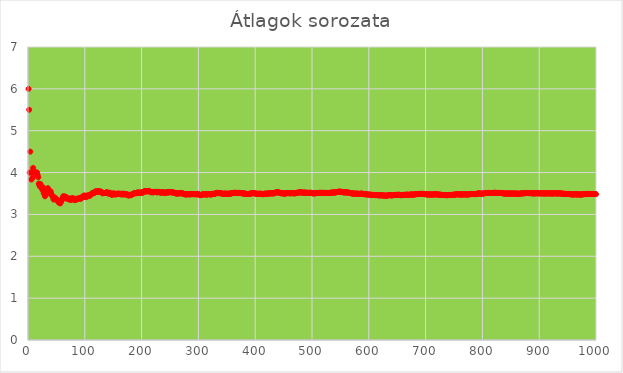
| Category | Series 0 |
|---|---|
| 1.0 | 6 |
| 2.0 | 5.5 |
| 3.0 | 4 |
| 4.0 | 4.5 |
| 5.0 | 4 |
| 6.0 | 3.833 |
| 7.0 | 4 |
| 8.0 | 3.875 |
| 9.0 | 4.111 |
| 10.0 | 4 |
| 11.0 | 4 |
| 12.0 | 4 |
| 13.0 | 4 |
| 14.0 | 4 |
| 15.0 | 4 |
| 16.0 | 4 |
| 17.0 | 3.941 |
| 18.0 | 3.889 |
| 19.0 | 3.737 |
| 20.0 | 3.7 |
| 21.0 | 3.667 |
| 22.0 | 3.727 |
| 23.0 | 3.652 |
| 24.0 | 3.667 |
| 25.0 | 3.6 |
| 26.0 | 3.654 |
| 27.0 | 3.556 |
| 28.0 | 3.5 |
| 29.0 | 3.483 |
| 30.0 | 3.433 |
| 31.0 | 3.484 |
| 32.0 | 3.531 |
| 33.0 | 3.515 |
| 34.0 | 3.559 |
| 35.0 | 3.629 |
| 36.0 | 3.583 |
| 37.0 | 3.514 |
| 38.0 | 3.5 |
| 39.0 | 3.538 |
| 40.0 | 3.55 |
| 41.0 | 3.488 |
| 42.0 | 3.452 |
| 43.0 | 3.442 |
| 44.0 | 3.409 |
| 45.0 | 3.356 |
| 46.0 | 3.413 |
| 47.0 | 3.383 |
| 48.0 | 3.375 |
| 49.0 | 3.388 |
| 50.0 | 3.36 |
| 51.0 | 3.353 |
| 52.0 | 3.327 |
| 53.0 | 3.302 |
| 54.0 | 3.315 |
| 55.0 | 3.273 |
| 56.0 | 3.286 |
| 57.0 | 3.263 |
| 58.0 | 3.31 |
| 59.0 | 3.322 |
| 60.0 | 3.35 |
| 61.0 | 3.393 |
| 62.0 | 3.435 |
| 63.0 | 3.397 |
| 64.0 | 3.406 |
| 65.0 | 3.431 |
| 66.0 | 3.409 |
| 67.0 | 3.418 |
| 68.0 | 3.382 |
| 69.0 | 3.391 |
| 70.0 | 3.371 |
| 71.0 | 3.366 |
| 72.0 | 3.375 |
| 73.0 | 3.356 |
| 74.0 | 3.378 |
| 75.0 | 3.347 |
| 76.0 | 3.382 |
| 77.0 | 3.351 |
| 78.0 | 3.372 |
| 79.0 | 3.392 |
| 80.0 | 3.362 |
| 81.0 | 3.358 |
| 82.0 | 3.341 |
| 83.0 | 3.361 |
| 84.0 | 3.345 |
| 85.0 | 3.376 |
| 86.0 | 3.36 |
| 87.0 | 3.368 |
| 88.0 | 3.375 |
| 89.0 | 3.382 |
| 90.0 | 3.389 |
| 91.0 | 3.385 |
| 92.0 | 3.38 |
| 93.0 | 3.376 |
| 94.0 | 3.383 |
| 95.0 | 3.411 |
| 96.0 | 3.427 |
| 97.0 | 3.412 |
| 98.0 | 3.439 |
| 99.0 | 3.455 |
| 100.0 | 3.43 |
| 101.0 | 3.426 |
| 102.0 | 3.412 |
| 103.0 | 3.437 |
| 104.0 | 3.452 |
| 105.0 | 3.429 |
| 106.0 | 3.453 |
| 107.0 | 3.458 |
| 108.0 | 3.444 |
| 109.0 | 3.468 |
| 110.0 | 3.455 |
| 111.0 | 3.477 |
| 112.0 | 3.5 |
| 113.0 | 3.504 |
| 114.0 | 3.518 |
| 115.0 | 3.504 |
| 116.0 | 3.517 |
| 117.0 | 3.513 |
| 118.0 | 3.534 |
| 119.0 | 3.555 |
| 120.0 | 3.533 |
| 121.0 | 3.545 |
| 122.0 | 3.549 |
| 123.0 | 3.545 |
| 124.0 | 3.548 |
| 125.0 | 3.56 |
| 126.0 | 3.54 |
| 127.0 | 3.535 |
| 128.0 | 3.547 |
| 129.0 | 3.543 |
| 130.0 | 3.523 |
| 131.0 | 3.504 |
| 132.0 | 3.508 |
| 133.0 | 3.511 |
| 134.0 | 3.515 |
| 135.0 | 3.511 |
| 136.0 | 3.515 |
| 137.0 | 3.511 |
| 138.0 | 3.529 |
| 139.0 | 3.532 |
| 140.0 | 3.514 |
| 141.0 | 3.511 |
| 142.0 | 3.493 |
| 143.0 | 3.503 |
| 144.0 | 3.521 |
| 145.0 | 3.503 |
| 146.0 | 3.486 |
| 147.0 | 3.476 |
| 148.0 | 3.466 |
| 149.0 | 3.483 |
| 150.0 | 3.5 |
| 151.0 | 3.503 |
| 152.0 | 3.493 |
| 153.0 | 3.477 |
| 154.0 | 3.474 |
| 155.0 | 3.49 |
| 156.0 | 3.494 |
| 157.0 | 3.497 |
| 158.0 | 3.487 |
| 159.0 | 3.497 |
| 160.0 | 3.494 |
| 161.0 | 3.491 |
| 162.0 | 3.494 |
| 163.0 | 3.479 |
| 164.0 | 3.488 |
| 165.0 | 3.497 |
| 166.0 | 3.482 |
| 167.0 | 3.473 |
| 168.0 | 3.488 |
| 169.0 | 3.497 |
| 170.0 | 3.482 |
| 171.0 | 3.48 |
| 172.0 | 3.483 |
| 173.0 | 3.474 |
| 174.0 | 3.477 |
| 175.0 | 3.48 |
| 176.0 | 3.466 |
| 177.0 | 3.452 |
| 178.0 | 3.455 |
| 179.0 | 3.464 |
| 180.0 | 3.472 |
| 181.0 | 3.459 |
| 182.0 | 3.467 |
| 183.0 | 3.475 |
| 184.0 | 3.484 |
| 185.0 | 3.497 |
| 186.0 | 3.495 |
| 187.0 | 3.503 |
| 188.0 | 3.511 |
| 189.0 | 3.503 |
| 190.0 | 3.511 |
| 191.0 | 3.508 |
| 192.0 | 3.516 |
| 193.0 | 3.528 |
| 194.0 | 3.521 |
| 195.0 | 3.518 |
| 196.0 | 3.51 |
| 197.0 | 3.518 |
| 198.0 | 3.525 |
| 199.0 | 3.518 |
| 200.0 | 3.53 |
| 201.0 | 3.517 |
| 202.0 | 3.525 |
| 203.0 | 3.532 |
| 204.0 | 3.544 |
| 205.0 | 3.556 |
| 206.0 | 3.558 |
| 207.0 | 3.556 |
| 208.0 | 3.553 |
| 209.0 | 3.545 |
| 210.0 | 3.557 |
| 211.0 | 3.559 |
| 212.0 | 3.561 |
| 213.0 | 3.549 |
| 214.0 | 3.551 |
| 215.0 | 3.549 |
| 216.0 | 3.537 |
| 217.0 | 3.53 |
| 218.0 | 3.532 |
| 219.0 | 3.525 |
| 220.0 | 3.536 |
| 221.0 | 3.529 |
| 222.0 | 3.536 |
| 223.0 | 3.534 |
| 224.0 | 3.54 |
| 225.0 | 3.538 |
| 226.0 | 3.535 |
| 227.0 | 3.524 |
| 228.0 | 3.531 |
| 229.0 | 3.541 |
| 230.0 | 3.535 |
| 231.0 | 3.537 |
| 232.0 | 3.526 |
| 233.0 | 3.519 |
| 234.0 | 3.521 |
| 235.0 | 3.523 |
| 236.0 | 3.525 |
| 237.0 | 3.527 |
| 238.0 | 3.534 |
| 239.0 | 3.523 |
| 240.0 | 3.512 |
| 241.0 | 3.515 |
| 242.0 | 3.512 |
| 243.0 | 3.523 |
| 244.0 | 3.533 |
| 245.0 | 3.527 |
| 246.0 | 3.524 |
| 247.0 | 3.522 |
| 248.0 | 3.532 |
| 249.0 | 3.538 |
| 250.0 | 3.536 |
| 251.0 | 3.526 |
| 252.0 | 3.536 |
| 253.0 | 3.53 |
| 254.0 | 3.531 |
| 255.0 | 3.529 |
| 256.0 | 3.52 |
| 257.0 | 3.514 |
| 258.0 | 3.519 |
| 259.0 | 3.51 |
| 260.0 | 3.504 |
| 261.0 | 3.498 |
| 262.0 | 3.5 |
| 263.0 | 3.506 |
| 264.0 | 3.504 |
| 265.0 | 3.502 |
| 266.0 | 3.5 |
| 267.0 | 3.509 |
| 268.0 | 3.515 |
| 269.0 | 3.506 |
| 270.0 | 3.504 |
| 271.0 | 3.502 |
| 272.0 | 3.5 |
| 273.0 | 3.502 |
| 274.0 | 3.493 |
| 275.0 | 3.487 |
| 276.0 | 3.478 |
| 277.0 | 3.484 |
| 278.0 | 3.478 |
| 279.0 | 3.477 |
| 280.0 | 3.486 |
| 281.0 | 3.477 |
| 282.0 | 3.486 |
| 283.0 | 3.484 |
| 284.0 | 3.482 |
| 285.0 | 3.477 |
| 286.0 | 3.483 |
| 287.0 | 3.484 |
| 288.0 | 3.49 |
| 289.0 | 3.481 |
| 290.0 | 3.49 |
| 291.0 | 3.485 |
| 292.0 | 3.49 |
| 293.0 | 3.485 |
| 294.0 | 3.48 |
| 295.0 | 3.488 |
| 296.0 | 3.483 |
| 297.0 | 3.478 |
| 298.0 | 3.487 |
| 299.0 | 3.492 |
| 300.0 | 3.483 |
| 301.0 | 3.475 |
| 302.0 | 3.47 |
| 303.0 | 3.462 |
| 304.0 | 3.461 |
| 305.0 | 3.466 |
| 306.0 | 3.474 |
| 307.0 | 3.482 |
| 308.0 | 3.474 |
| 309.0 | 3.482 |
| 310.0 | 3.487 |
| 311.0 | 3.479 |
| 312.0 | 3.474 |
| 313.0 | 3.482 |
| 314.0 | 3.478 |
| 315.0 | 3.473 |
| 316.0 | 3.481 |
| 317.0 | 3.486 |
| 318.0 | 3.481 |
| 319.0 | 3.483 |
| 320.0 | 3.484 |
| 321.0 | 3.48 |
| 322.0 | 3.475 |
| 323.0 | 3.477 |
| 324.0 | 3.485 |
| 325.0 | 3.492 |
| 326.0 | 3.494 |
| 327.0 | 3.489 |
| 328.0 | 3.488 |
| 329.0 | 3.492 |
| 330.0 | 3.5 |
| 331.0 | 3.508 |
| 332.0 | 3.515 |
| 333.0 | 3.517 |
| 334.0 | 3.512 |
| 335.0 | 3.513 |
| 336.0 | 3.509 |
| 337.0 | 3.504 |
| 338.0 | 3.509 |
| 339.0 | 3.513 |
| 340.0 | 3.506 |
| 341.0 | 3.499 |
| 342.0 | 3.5 |
| 343.0 | 3.493 |
| 344.0 | 3.491 |
| 345.0 | 3.49 |
| 346.0 | 3.497 |
| 347.0 | 3.501 |
| 348.0 | 3.494 |
| 349.0 | 3.49 |
| 350.0 | 3.491 |
| 351.0 | 3.49 |
| 352.0 | 3.497 |
| 353.0 | 3.499 |
| 354.0 | 3.494 |
| 355.0 | 3.49 |
| 356.0 | 3.494 |
| 357.0 | 3.501 |
| 358.0 | 3.503 |
| 359.0 | 3.51 |
| 360.0 | 3.508 |
| 361.0 | 3.507 |
| 362.0 | 3.514 |
| 363.0 | 3.515 |
| 364.0 | 3.511 |
| 365.0 | 3.518 |
| 366.0 | 3.514 |
| 367.0 | 3.518 |
| 368.0 | 3.514 |
| 369.0 | 3.509 |
| 370.0 | 3.508 |
| 371.0 | 3.515 |
| 372.0 | 3.516 |
| 373.0 | 3.512 |
| 374.0 | 3.511 |
| 375.0 | 3.509 |
| 376.0 | 3.508 |
| 377.0 | 3.504 |
| 378.0 | 3.503 |
| 379.0 | 3.504 |
| 380.0 | 3.497 |
| 381.0 | 3.499 |
| 382.0 | 3.497 |
| 383.0 | 3.491 |
| 384.0 | 3.495 |
| 385.0 | 3.488 |
| 386.0 | 3.487 |
| 387.0 | 3.488 |
| 388.0 | 3.49 |
| 389.0 | 3.488 |
| 390.0 | 3.492 |
| 391.0 | 3.499 |
| 392.0 | 3.497 |
| 393.0 | 3.499 |
| 394.0 | 3.505 |
| 395.0 | 3.509 |
| 396.0 | 3.505 |
| 397.0 | 3.509 |
| 398.0 | 3.508 |
| 399.0 | 3.506 |
| 400.0 | 3.5 |
| 401.0 | 3.496 |
| 402.0 | 3.498 |
| 403.0 | 3.494 |
| 404.0 | 3.493 |
| 405.0 | 3.489 |
| 406.0 | 3.495 |
| 407.0 | 3.494 |
| 408.0 | 3.493 |
| 409.0 | 3.491 |
| 410.0 | 3.495 |
| 411.0 | 3.494 |
| 412.0 | 3.488 |
| 413.0 | 3.482 |
| 414.0 | 3.483 |
| 415.0 | 3.489 |
| 416.0 | 3.495 |
| 417.0 | 3.492 |
| 418.0 | 3.498 |
| 419.0 | 3.499 |
| 420.0 | 3.495 |
| 421.0 | 3.492 |
| 422.0 | 3.498 |
| 423.0 | 3.499 |
| 424.0 | 3.505 |
| 425.0 | 3.506 |
| 426.0 | 3.502 |
| 427.0 | 3.501 |
| 428.0 | 3.502 |
| 429.0 | 3.503 |
| 430.0 | 3.509 |
| 431.0 | 3.503 |
| 432.0 | 3.5 |
| 433.0 | 3.506 |
| 434.0 | 3.512 |
| 435.0 | 3.517 |
| 436.0 | 3.523 |
| 437.0 | 3.526 |
| 438.0 | 3.53 |
| 439.0 | 3.531 |
| 440.0 | 3.527 |
| 441.0 | 3.524 |
| 442.0 | 3.525 |
| 443.0 | 3.519 |
| 444.0 | 3.514 |
| 445.0 | 3.508 |
| 446.0 | 3.504 |
| 447.0 | 3.508 |
| 448.0 | 3.504 |
| 449.0 | 3.503 |
| 450.0 | 3.502 |
| 451.0 | 3.497 |
| 452.0 | 3.496 |
| 453.0 | 3.501 |
| 454.0 | 3.507 |
| 455.0 | 3.505 |
| 456.0 | 3.507 |
| 457.0 | 3.508 |
| 458.0 | 3.511 |
| 459.0 | 3.508 |
| 460.0 | 3.509 |
| 461.0 | 3.503 |
| 462.0 | 3.509 |
| 463.0 | 3.503 |
| 464.0 | 3.506 |
| 465.0 | 3.508 |
| 466.0 | 3.513 |
| 467.0 | 3.507 |
| 468.0 | 3.502 |
| 469.0 | 3.503 |
| 470.0 | 3.504 |
| 471.0 | 3.51 |
| 472.0 | 3.508 |
| 473.0 | 3.514 |
| 474.0 | 3.519 |
| 475.0 | 3.518 |
| 476.0 | 3.519 |
| 477.0 | 3.524 |
| 478.0 | 3.529 |
| 479.0 | 3.532 |
| 480.0 | 3.529 |
| 481.0 | 3.524 |
| 482.0 | 3.527 |
| 483.0 | 3.522 |
| 484.0 | 3.521 |
| 485.0 | 3.52 |
| 486.0 | 3.519 |
| 487.0 | 3.522 |
| 488.0 | 3.518 |
| 489.0 | 3.521 |
| 490.0 | 3.518 |
| 491.0 | 3.515 |
| 492.0 | 3.514 |
| 493.0 | 3.515 |
| 494.0 | 3.518 |
| 495.0 | 3.515 |
| 496.0 | 3.512 |
| 497.0 | 3.517 |
| 498.0 | 3.518 |
| 499.0 | 3.513 |
| 500.0 | 3.512 |
| 501.0 | 3.507 |
| 502.0 | 3.502 |
| 503.0 | 3.507 |
| 504.0 | 3.506 |
| 505.0 | 3.501 |
| 506.0 | 3.506 |
| 507.0 | 3.509 |
| 508.0 | 3.51 |
| 509.0 | 3.509 |
| 510.0 | 3.51 |
| 511.0 | 3.511 |
| 512.0 | 3.514 |
| 513.0 | 3.517 |
| 514.0 | 3.514 |
| 515.0 | 3.518 |
| 516.0 | 3.516 |
| 517.0 | 3.511 |
| 518.0 | 3.515 |
| 519.0 | 3.514 |
| 520.0 | 3.513 |
| 521.0 | 3.512 |
| 522.0 | 3.517 |
| 523.0 | 3.514 |
| 524.0 | 3.51 |
| 525.0 | 3.514 |
| 526.0 | 3.511 |
| 527.0 | 3.51 |
| 528.0 | 3.515 |
| 529.0 | 3.51 |
| 530.0 | 3.513 |
| 531.0 | 3.512 |
| 532.0 | 3.517 |
| 533.0 | 3.518 |
| 534.0 | 3.521 |
| 535.0 | 3.521 |
| 536.0 | 3.522 |
| 537.0 | 3.525 |
| 538.0 | 3.522 |
| 539.0 | 3.525 |
| 540.0 | 3.522 |
| 541.0 | 3.525 |
| 542.0 | 3.53 |
| 543.0 | 3.532 |
| 544.0 | 3.537 |
| 545.0 | 3.536 |
| 546.0 | 3.54 |
| 547.0 | 3.541 |
| 548.0 | 3.546 |
| 549.0 | 3.545 |
| 550.0 | 3.544 |
| 551.0 | 3.541 |
| 552.0 | 3.536 |
| 553.0 | 3.537 |
| 554.0 | 3.532 |
| 555.0 | 3.528 |
| 556.0 | 3.529 |
| 557.0 | 3.526 |
| 558.0 | 3.525 |
| 559.0 | 3.528 |
| 560.0 | 3.527 |
| 561.0 | 3.526 |
| 562.0 | 3.527 |
| 563.0 | 3.524 |
| 564.0 | 3.52 |
| 565.0 | 3.519 |
| 566.0 | 3.516 |
| 567.0 | 3.513 |
| 568.0 | 3.509 |
| 569.0 | 3.506 |
| 570.0 | 3.505 |
| 571.0 | 3.501 |
| 572.0 | 3.497 |
| 573.0 | 3.497 |
| 574.0 | 3.495 |
| 575.0 | 3.499 |
| 576.0 | 3.497 |
| 577.0 | 3.497 |
| 578.0 | 3.495 |
| 579.0 | 3.496 |
| 580.0 | 3.495 |
| 581.0 | 3.494 |
| 582.0 | 3.493 |
| 583.0 | 3.492 |
| 584.0 | 3.49 |
| 585.0 | 3.494 |
| 586.0 | 3.495 |
| 587.0 | 3.497 |
| 588.0 | 3.497 |
| 589.0 | 3.494 |
| 590.0 | 3.49 |
| 591.0 | 3.486 |
| 592.0 | 3.483 |
| 593.0 | 3.482 |
| 594.0 | 3.485 |
| 595.0 | 3.481 |
| 596.0 | 3.48 |
| 597.0 | 3.481 |
| 598.0 | 3.477 |
| 599.0 | 3.474 |
| 600.0 | 3.475 |
| 601.0 | 3.473 |
| 602.0 | 3.472 |
| 603.0 | 3.469 |
| 604.0 | 3.467 |
| 605.0 | 3.468 |
| 606.0 | 3.469 |
| 607.0 | 3.465 |
| 608.0 | 3.464 |
| 609.0 | 3.465 |
| 610.0 | 3.466 |
| 611.0 | 3.463 |
| 612.0 | 3.461 |
| 613.0 | 3.465 |
| 614.0 | 3.463 |
| 615.0 | 3.46 |
| 616.0 | 3.461 |
| 617.0 | 3.457 |
| 618.0 | 3.456 |
| 619.0 | 3.454 |
| 620.0 | 3.456 |
| 621.0 | 3.461 |
| 622.0 | 3.457 |
| 623.0 | 3.457 |
| 624.0 | 3.455 |
| 625.0 | 3.456 |
| 626.0 | 3.455 |
| 627.0 | 3.453 |
| 628.0 | 3.449 |
| 629.0 | 3.445 |
| 630.0 | 3.448 |
| 631.0 | 3.448 |
| 632.0 | 3.449 |
| 633.0 | 3.453 |
| 634.0 | 3.454 |
| 635.0 | 3.458 |
| 636.0 | 3.461 |
| 637.0 | 3.465 |
| 638.0 | 3.461 |
| 639.0 | 3.457 |
| 640.0 | 3.453 |
| 641.0 | 3.456 |
| 642.0 | 3.46 |
| 643.0 | 3.46 |
| 644.0 | 3.464 |
| 645.0 | 3.464 |
| 646.0 | 3.463 |
| 647.0 | 3.467 |
| 648.0 | 3.465 |
| 649.0 | 3.465 |
| 650.0 | 3.468 |
| 651.0 | 3.467 |
| 652.0 | 3.471 |
| 653.0 | 3.47 |
| 654.0 | 3.466 |
| 655.0 | 3.464 |
| 656.0 | 3.462 |
| 657.0 | 3.458 |
| 658.0 | 3.462 |
| 659.0 | 3.464 |
| 660.0 | 3.465 |
| 661.0 | 3.469 |
| 662.0 | 3.467 |
| 663.0 | 3.466 |
| 664.0 | 3.468 |
| 665.0 | 3.469 |
| 666.0 | 3.47 |
| 667.0 | 3.474 |
| 668.0 | 3.47 |
| 669.0 | 3.469 |
| 670.0 | 3.469 |
| 671.0 | 3.468 |
| 672.0 | 3.472 |
| 673.0 | 3.473 |
| 674.0 | 3.476 |
| 675.0 | 3.477 |
| 676.0 | 3.475 |
| 677.0 | 3.474 |
| 678.0 | 3.473 |
| 679.0 | 3.474 |
| 680.0 | 3.475 |
| 681.0 | 3.479 |
| 682.0 | 3.482 |
| 683.0 | 3.486 |
| 684.0 | 3.484 |
| 685.0 | 3.485 |
| 686.0 | 3.485 |
| 687.0 | 3.488 |
| 688.0 | 3.488 |
| 689.0 | 3.492 |
| 690.0 | 3.49 |
| 691.0 | 3.493 |
| 692.0 | 3.49 |
| 693.0 | 3.492 |
| 694.0 | 3.491 |
| 695.0 | 3.489 |
| 696.0 | 3.49 |
| 697.0 | 3.486 |
| 698.0 | 3.484 |
| 699.0 | 3.485 |
| 700.0 | 3.483 |
| 701.0 | 3.481 |
| 702.0 | 3.479 |
| 703.0 | 3.475 |
| 704.0 | 3.479 |
| 705.0 | 3.479 |
| 706.0 | 3.477 |
| 707.0 | 3.474 |
| 708.0 | 3.477 |
| 709.0 | 3.477 |
| 710.0 | 3.475 |
| 711.0 | 3.475 |
| 712.0 | 3.479 |
| 713.0 | 3.478 |
| 714.0 | 3.479 |
| 715.0 | 3.478 |
| 716.0 | 3.478 |
| 717.0 | 3.478 |
| 718.0 | 3.481 |
| 719.0 | 3.483 |
| 720.0 | 3.479 |
| 721.0 | 3.477 |
| 722.0 | 3.474 |
| 723.0 | 3.473 |
| 724.0 | 3.472 |
| 725.0 | 3.473 |
| 726.0 | 3.47 |
| 727.0 | 3.469 |
| 728.0 | 3.468 |
| 729.0 | 3.465 |
| 730.0 | 3.464 |
| 731.0 | 3.466 |
| 732.0 | 3.463 |
| 733.0 | 3.465 |
| 734.0 | 3.463 |
| 735.0 | 3.461 |
| 736.0 | 3.461 |
| 737.0 | 3.46 |
| 738.0 | 3.459 |
| 739.0 | 3.46 |
| 740.0 | 3.464 |
| 741.0 | 3.467 |
| 742.0 | 3.465 |
| 743.0 | 3.463 |
| 744.0 | 3.465 |
| 745.0 | 3.466 |
| 746.0 | 3.466 |
| 747.0 | 3.469 |
| 748.0 | 3.468 |
| 749.0 | 3.47 |
| 750.0 | 3.471 |
| 751.0 | 3.471 |
| 752.0 | 3.475 |
| 753.0 | 3.478 |
| 754.0 | 3.48 |
| 755.0 | 3.479 |
| 756.0 | 3.483 |
| 757.0 | 3.481 |
| 758.0 | 3.48 |
| 759.0 | 3.478 |
| 760.0 | 3.476 |
| 761.0 | 3.478 |
| 762.0 | 3.478 |
| 763.0 | 3.476 |
| 764.0 | 3.476 |
| 765.0 | 3.476 |
| 766.0 | 3.479 |
| 767.0 | 3.481 |
| 768.0 | 3.479 |
| 769.0 | 3.481 |
| 770.0 | 3.478 |
| 771.0 | 3.477 |
| 772.0 | 3.475 |
| 773.0 | 3.475 |
| 774.0 | 3.478 |
| 775.0 | 3.476 |
| 776.0 | 3.478 |
| 777.0 | 3.481 |
| 778.0 | 3.485 |
| 779.0 | 3.488 |
| 780.0 | 3.486 |
| 781.0 | 3.484 |
| 782.0 | 3.487 |
| 783.0 | 3.487 |
| 784.0 | 3.489 |
| 785.0 | 3.489 |
| 786.0 | 3.486 |
| 787.0 | 3.483 |
| 788.0 | 3.486 |
| 789.0 | 3.489 |
| 790.0 | 3.492 |
| 791.0 | 3.496 |
| 792.0 | 3.499 |
| 793.0 | 3.502 |
| 794.0 | 3.499 |
| 795.0 | 3.502 |
| 796.0 | 3.499 |
| 797.0 | 3.497 |
| 798.0 | 3.495 |
| 799.0 | 3.493 |
| 800.0 | 3.496 |
| 801.0 | 3.498 |
| 802.0 | 3.501 |
| 803.0 | 3.504 |
| 804.0 | 3.506 |
| 805.0 | 3.509 |
| 806.0 | 3.511 |
| 807.0 | 3.513 |
| 808.0 | 3.514 |
| 809.0 | 3.513 |
| 810.0 | 3.515 |
| 811.0 | 3.515 |
| 812.0 | 3.512 |
| 813.0 | 3.51 |
| 814.0 | 3.509 |
| 815.0 | 3.51 |
| 816.0 | 3.512 |
| 817.0 | 3.515 |
| 818.0 | 3.512 |
| 819.0 | 3.512 |
| 820.0 | 3.515 |
| 821.0 | 3.518 |
| 822.0 | 3.517 |
| 823.0 | 3.516 |
| 824.0 | 3.513 |
| 825.0 | 3.516 |
| 826.0 | 3.513 |
| 827.0 | 3.511 |
| 828.0 | 3.514 |
| 829.0 | 3.514 |
| 830.0 | 3.511 |
| 831.0 | 3.514 |
| 832.0 | 3.513 |
| 833.0 | 3.513 |
| 834.0 | 3.512 |
| 835.0 | 3.509 |
| 836.0 | 3.506 |
| 837.0 | 3.503 |
| 838.0 | 3.5 |
| 839.0 | 3.498 |
| 840.0 | 3.5 |
| 841.0 | 3.497 |
| 842.0 | 3.5 |
| 843.0 | 3.501 |
| 844.0 | 3.498 |
| 845.0 | 3.497 |
| 846.0 | 3.5 |
| 847.0 | 3.503 |
| 848.0 | 3.5 |
| 849.0 | 3.499 |
| 850.0 | 3.498 |
| 851.0 | 3.498 |
| 852.0 | 3.498 |
| 853.0 | 3.498 |
| 854.0 | 3.498 |
| 855.0 | 3.499 |
| 856.0 | 3.5 |
| 857.0 | 3.497 |
| 858.0 | 3.497 |
| 859.0 | 3.499 |
| 860.0 | 3.499 |
| 861.0 | 3.497 |
| 862.0 | 3.494 |
| 863.0 | 3.492 |
| 864.0 | 3.493 |
| 865.0 | 3.496 |
| 866.0 | 3.499 |
| 867.0 | 3.496 |
| 868.0 | 3.499 |
| 869.0 | 3.501 |
| 870.0 | 3.503 |
| 871.0 | 3.505 |
| 872.0 | 3.505 |
| 873.0 | 3.506 |
| 874.0 | 3.507 |
| 875.0 | 3.507 |
| 876.0 | 3.508 |
| 877.0 | 3.511 |
| 878.0 | 3.51 |
| 879.0 | 3.513 |
| 880.0 | 3.51 |
| 881.0 | 3.509 |
| 882.0 | 3.511 |
| 883.0 | 3.508 |
| 884.0 | 3.51 |
| 885.0 | 3.508 |
| 886.0 | 3.507 |
| 887.0 | 3.506 |
| 888.0 | 3.503 |
| 889.0 | 3.504 |
| 890.0 | 3.501 |
| 891.0 | 3.503 |
| 892.0 | 3.506 |
| 893.0 | 3.504 |
| 894.0 | 3.506 |
| 895.0 | 3.507 |
| 896.0 | 3.506 |
| 897.0 | 3.505 |
| 898.0 | 3.504 |
| 899.0 | 3.505 |
| 900.0 | 3.504 |
| 901.0 | 3.503 |
| 902.0 | 3.503 |
| 903.0 | 3.503 |
| 904.0 | 3.506 |
| 905.0 | 3.505 |
| 906.0 | 3.503 |
| 907.0 | 3.501 |
| 908.0 | 3.503 |
| 909.0 | 3.502 |
| 910.0 | 3.502 |
| 911.0 | 3.499 |
| 912.0 | 3.502 |
| 913.0 | 3.505 |
| 914.0 | 3.505 |
| 915.0 | 3.503 |
| 916.0 | 3.502 |
| 917.0 | 3.504 |
| 918.0 | 3.505 |
| 919.0 | 3.504 |
| 920.0 | 3.501 |
| 921.0 | 3.503 |
| 922.0 | 3.5 |
| 923.0 | 3.501 |
| 924.0 | 3.503 |
| 925.0 | 3.502 |
| 926.0 | 3.504 |
| 927.0 | 3.504 |
| 928.0 | 3.504 |
| 929.0 | 3.505 |
| 930.0 | 3.504 |
| 931.0 | 3.502 |
| 932.0 | 3.501 |
| 933.0 | 3.499 |
| 934.0 | 3.502 |
| 935.0 | 3.503 |
| 936.0 | 3.505 |
| 937.0 | 3.503 |
| 938.0 | 3.5 |
| 939.0 | 3.499 |
| 940.0 | 3.497 |
| 941.0 | 3.496 |
| 942.0 | 3.494 |
| 943.0 | 3.493 |
| 944.0 | 3.492 |
| 945.0 | 3.493 |
| 946.0 | 3.49 |
| 947.0 | 3.49 |
| 948.0 | 3.489 |
| 949.0 | 3.487 |
| 950.0 | 3.488 |
| 951.0 | 3.491 |
| 952.0 | 3.488 |
| 953.0 | 3.487 |
| 954.0 | 3.484 |
| 955.0 | 3.482 |
| 956.0 | 3.479 |
| 957.0 | 3.481 |
| 958.0 | 3.478 |
| 959.0 | 3.478 |
| 960.0 | 3.477 |
| 961.0 | 3.479 |
| 962.0 | 3.48 |
| 963.0 | 3.483 |
| 964.0 | 3.48 |
| 965.0 | 3.481 |
| 966.0 | 3.478 |
| 967.0 | 3.478 |
| 968.0 | 3.479 |
| 969.0 | 3.48 |
| 970.0 | 3.477 |
| 971.0 | 3.478 |
| 972.0 | 3.476 |
| 973.0 | 3.476 |
| 974.0 | 3.476 |
| 975.0 | 3.478 |
| 976.0 | 3.48 |
| 977.0 | 3.481 |
| 978.0 | 3.484 |
| 979.0 | 3.484 |
| 980.0 | 3.486 |
| 981.0 | 3.487 |
| 982.0 | 3.485 |
| 983.0 | 3.486 |
| 984.0 | 3.488 |
| 985.0 | 3.489 |
| 986.0 | 3.49 |
| 987.0 | 3.491 |
| 988.0 | 3.489 |
| 989.0 | 3.487 |
| 990.0 | 3.49 |
| 991.0 | 3.488 |
| 992.0 | 3.487 |
| 993.0 | 3.487 |
| 994.0 | 3.489 |
| 995.0 | 3.487 |
| 996.0 | 3.488 |
| 997.0 | 3.486 |
| 998.0 | 3.488 |
| 999.0 | 3.485 |
| 1000.0 | 3.485 |